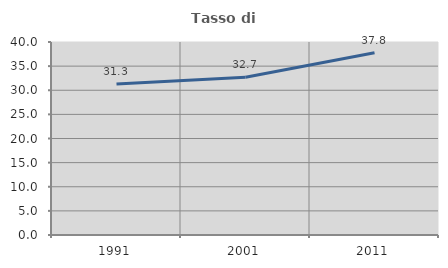
| Category | Tasso di occupazione   |
|---|---|
| 1991.0 | 31.296 |
| 2001.0 | 32.683 |
| 2011.0 | 37.79 |